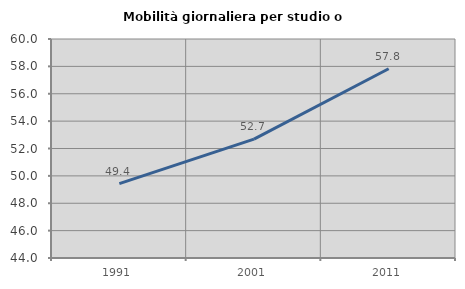
| Category | Mobilità giornaliera per studio o lavoro |
|---|---|
| 1991.0 | 49.437 |
| 2001.0 | 52.681 |
| 2011.0 | 57.824 |